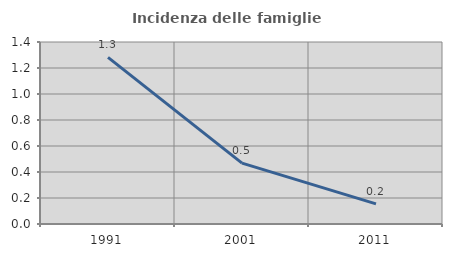
| Category | Incidenza delle famiglie numerose |
|---|---|
| 1991.0 | 1.282 |
| 2001.0 | 0.469 |
| 2011.0 | 0.155 |